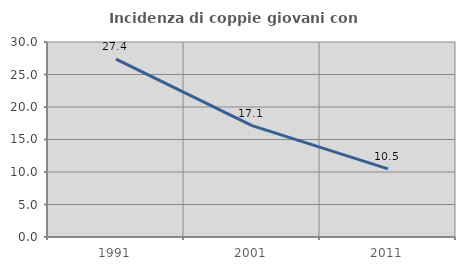
| Category | Incidenza di coppie giovani con figli |
|---|---|
| 1991.0 | 27.358 |
| 2001.0 | 17.137 |
| 2011.0 | 10.487 |